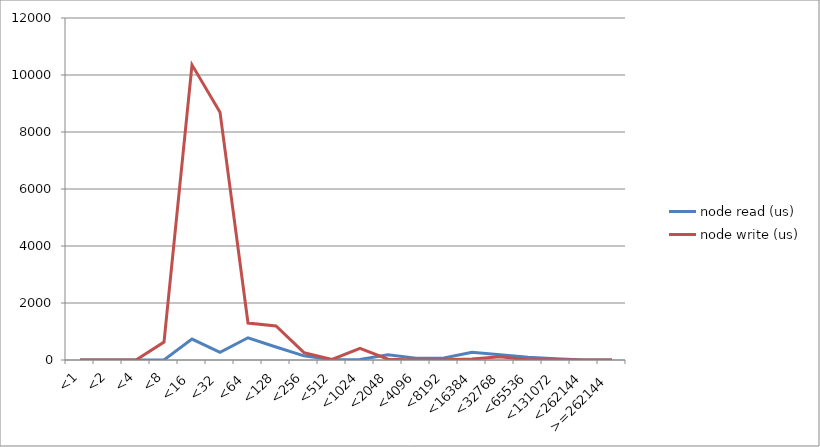
| Category | node read (us) | node write (us) |
|---|---|---|
| <1 | 0 | 0 |
| <2 | 0 | 0 |
| <4 | 0 | 0 |
| <8 | 4 | 629 |
| <16 | 736 | 10356 |
| <32 | 268 | 8697 |
| <64 | 780 | 1296 |
| <128 | 456 | 1193 |
| <256 | 147 | 259 |
| <512 | 10 | 18 |
| <1024 | 21 | 409 |
| <2048 | 181 | 28 |
| <4096 | 65 | 4 |
| <8192 | 70 | 5 |
| <16384 | 272 | 34 |
| <32768 | 183 | 113 |
| <65536 | 96 | 7 |
| <131072 | 47 | 7 |
| <262144 | 4 | 0 |
| >=262144 | 1 | 0 |